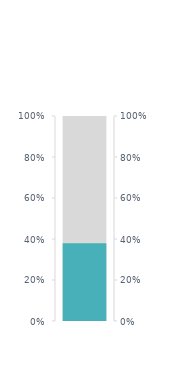
| Category | Тастау керек салмақ |
|---|---|
| 0 | 13.2 |